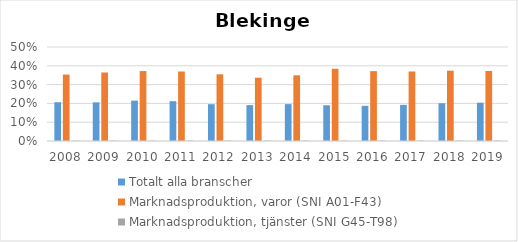
| Category | Totalt alla branscher | Marknadsproduktion, varor (SNI A01-F43) | Marknadsproduktion, tjänster (SNI G45-T98) |
|---|---|---|---|
| 2008 | 0.206 | 0.353 | 0.002 |
| 2009 | 0.206 | 0.364 | 0.002 |
| 2010 | 0.215 | 0.372 | 0.002 |
| 2011 | 0.212 | 0.37 | 0.002 |
| 2012 | 0.196 | 0.355 | 0.002 |
| 2013 | 0.191 | 0.337 | 0.002 |
| 2014 | 0.196 | 0.349 | 0.002 |
| 2015 | 0.19 | 0.384 | 0.002 |
| 2016 | 0.187 | 0.372 | 0.002 |
| 2017 | 0.192 | 0.37 | 0.002 |
| 2018 | 0.201 | 0.374 | 0.002 |
| 2019 | 0.204 | 0.372 | 0.002 |